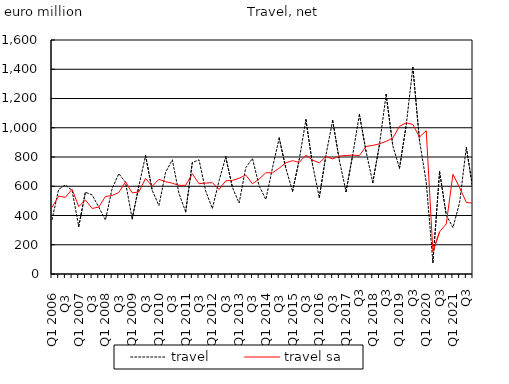
| Category | travel | travel sa |
|---|---|---|
| Q1 2006 | 372.066 | 455.962 |
| Q2  | 578.354 | 532.722 |
| Q3  | 608.9 | 523.706 |
| Q4  | 571.83 | 580.165 |
| Q1 2007 | 325.483 | 460.895 |
| Q2  | 559.185 | 505.843 |
| Q3  | 540.841 | 448.077 |
| Q4  | 457.24 | 457.651 |
| Q1 2008 | 369.453 | 529.71 |
| Q2  | 584.541 | 536.955 |
| Q3  | 686.338 | 556.923 |
| Q4  | 627.579 | 630.792 |
| Q1 2009 | 377.169 | 554.849 |
| Q2  | 601.191 | 561.301 |
| Q3  | 809.601 | 653.454 |
| Q4  | 571.981 | 599.85 |
| Q1 2010 | 467.797 | 647.507 |
| Q2  | 695.218 | 631.382 |
| Q3  | 781.3 | 620.805 |
| Q4  | 550.864 | 606.158 |
| Q1 2011 | 425.359 | 606.314 |
| Q2  | 762.02 | 685.167 |
| Q3  | 780.573 | 617.433 |
| Q4  | 567.462 | 621.619 |
| Q1 2012 | 447.402 | 624.809 |
| Q2  | 638.315 | 577.844 |
| Q3  | 800.377 | 636.953 |
| Q4  | 591.575 | 640.016 |
| Q1 2013 | 485.428 | 654.524 |
| Q2  | 727.049 | 676.46 |
| Q3  | 789.917 | 616.632 |
| Q4  | 602.173 | 649.897 |
| Q1 2014 | 509.562 | 691.835 |
| Q2  | 726.834 | 692.367 |
| Q3  | 929.651 | 723.639 |
| Q4  | 721.706 | 760.519 |
| Q1 2015 | 565.549 | 774.643 |
| Q2  | 783.148 | 763.471 |
| Q3  | 1054.633 | 812.31 |
| Q4 | 744.617 | 778.507 |
| Q1 2016 | 523.677 | 760.046 |
| Q2  | 815.062 | 803.036 |
| Q3  | 1049.503 | 786.922 |
| Q4 | 778.065 | 806.417 |
| Q1 2017 | 563.42 | 810.356 |
| Q2  | 814.147 | 812.528 |
| Q3 | 1091.381 | 809.724 |
| Q4 | 837.971 | 871.894 |
| Q1 2018 | 625.231 | 879.162 |
| Q2  | 883.094 | 889.9 |
| Q3 | 1227.194 | 906.779 |
| Q4 | 876.508 | 929.08 |
| Q1 2019 | 723.436 | 1010.173 |
| Q2  | 1016.431 | 1033.441 |
| Q3 | 1412.625 | 1022.868 |
| Q4 | 910.153 | 936.763 |
| Q1 2020 | 628.981 | 980.419 |
| Q2  | 79.149 | 153.72 |
| Q3 | 700.047 | 288.392 |
| Q4 | 402.945 | 342.914 |
| Q1 2021 | 317.026 | 682.038 |
| Q2  | 489.264 | 590.632 |
| Q3 | 865.842 | 489.772 |
| Q4 | 576.145 | 484.076 |